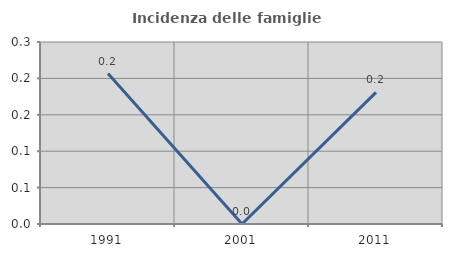
| Category | Incidenza delle famiglie numerose |
|---|---|
| 1991.0 | 0.207 |
| 2001.0 | 0 |
| 2011.0 | 0.181 |